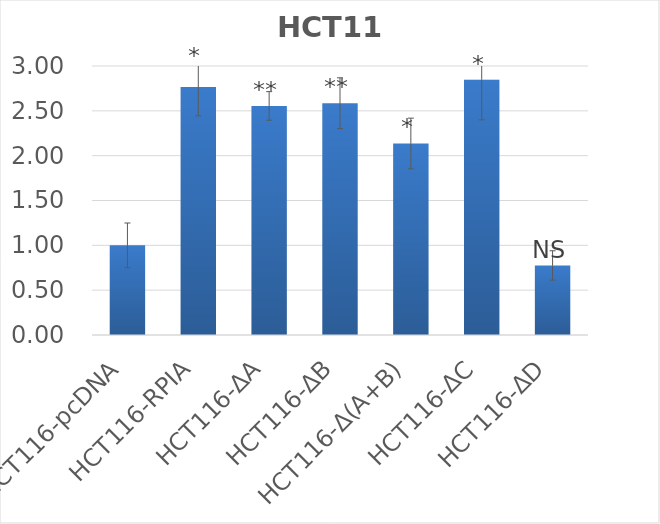
| Category | Series 0 |
|---|---|
| HCT116-pcDNA | 1 |
| HCT116-RPIA | 2.766 |
| HCT116-ΔA | 2.555 |
| HCT116-ΔB | 2.585 |
| HCT116-Δ(A+B) | 2.136 |
| HCT116-ΔC | 2.848 |
| HCT116-ΔD | 0.776 |